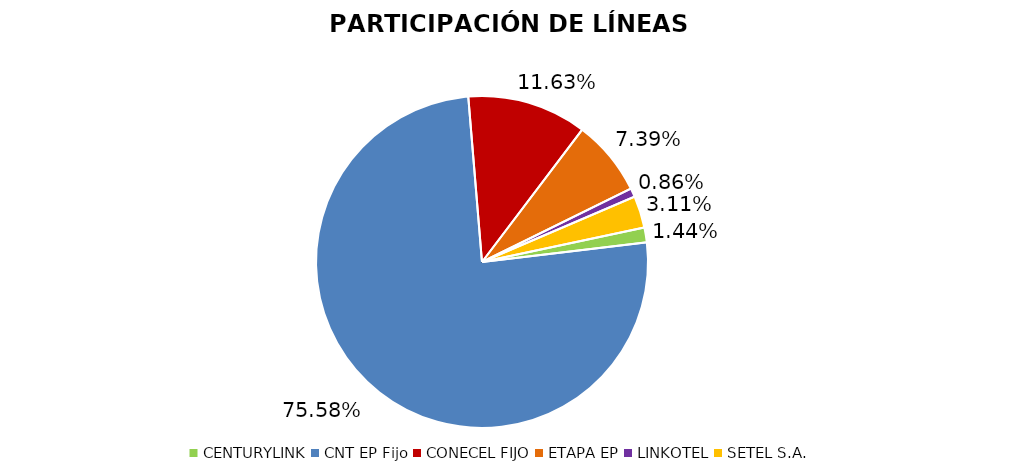
| Category | Participación en el Mercado |
|---|---|
| CENTURYLINK | 0.014 |
| CNT EP Fijo | 0.756 |
| CONECEL FIJO | 0.116 |
| ETAPA EP | 0.074 |
| LINKOTEL | 0.009 |
| SETEL S.A. | 0.031 |